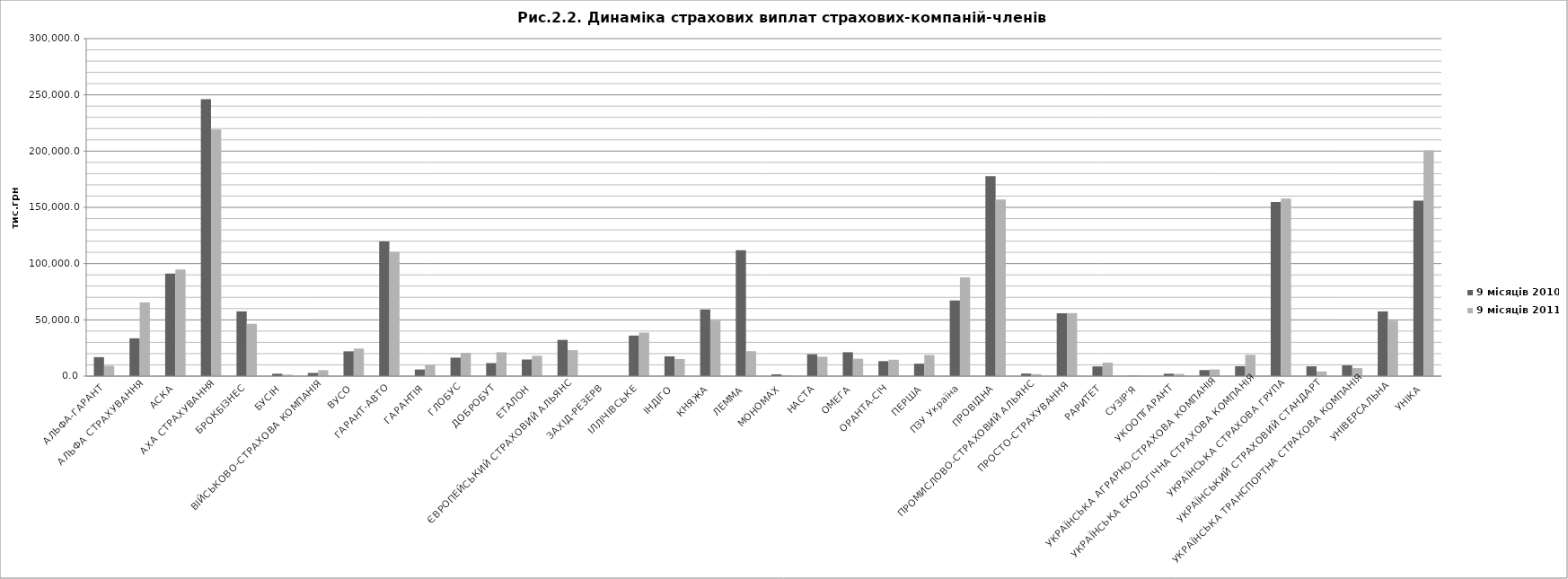
| Category | 9 місяців 2010 | 9 місяців 2011 |
|---|---|---|
| АЛЬФА-ГАРАНТ | 16873.3 | 9215.8 |
| АЛЬФА СТРАХУВАННЯ | 33590.1 | 65580.2 |
| АСКА | 91177.4 | 94719.6 |
| АХА СТРАХУВАННЯ | 246103 | 219163 |
| БРОКБІЗНЕС | 57544.4 | 46531.8 |
| БУСІН | 2130.9 | 1308.4 |
| ВІЙСЬКОВО-СТРАХОВА КОМПАНІЯ | 2833.9 | 5320.4 |
| ВУСО | 22053.3 | 24490.8 |
| ГАРАНТ-АВТО | 119729.9 | 110470.6 |
| ГАРАНТІЯ | 5883.4 | 10124.6 |
| ГЛОБУС | 16442.2 | 20727.8 |
| ДОБРОБУТ | 11585.7 | 21252.3 |
| ЕТАЛОН | 14773 | 18070.9 |
| ЄВРОПЕЙСЬКИЙ СТРАХОВИЙ АЛЬЯНС | 32199 | 23076.2 |
| ЗАХІД-РЕЗЕРВ | 27.9 | 13.8 |
| ІЛЛІЧІВСЬКЕ | 36046 | 38704.3 |
| ІНДІГО | 17539.9 | 15211.1 |
| КНЯЖА | 59256.8 | 49222.7 |
| ЛЕММА | 111958.9 | 22159.2 |
| МОНОМАХ | 1568 | 837.3 |
| НАСТА | 19490 | 17249.9 |
| ОМЕГА | 21228.2 | 15425 |
| ОРАНТА-СІЧ | 13302.6 | 14574.2 |
| ПЕРША | 11074 | 18824 |
| ПЗУ Україна | 67264.1 | 87716.5 |
| ПРОВІДНА | 177650.6 | 156973.3 |
| ПРОМИСЛОВО-СТРАХОВИЙ АЛЬЯНС | 2264.2 | 1665.9 |
| ПРОСТО-СТРАХУВАННЯ | 55769.5 | 55986.4 |
| РАРИТЕТ | 8634.5 | 12006.9 |
| СУЗІР'Я | 285.8 | 175.2 |
| УКООПГАРАНТ | 2168 | 1988.9 |
| УКРАЇНСЬКА АГРАРНО-СТРАХОВА КОМПАНІЯ | 5382.5 | 5968.2 |
| УКРАЇНСЬКА ЕКОЛОГІЧНА СТРАХОВА КОМПАНІЯ | 8839.7 | 18909.5 |
| УКРАЇНСЬКА СТРАХОВА ГРУПА | 154781.1 | 157694.6 |
| УКРАЇНСЬКИЙ СТРАХОВИЙ СТАНДАРТ | 8716.4 | 4130.3 |
| УКРАЇНСЬКА ТРАНСПОРТНА СТРАХОВА КОМПАНІЯ | 9523 | 7133 |
| УНІВЕРСАЛЬНА | 57530.4 | 49204.1 |
| УНІКА | 155913.5 | 200590.4 |